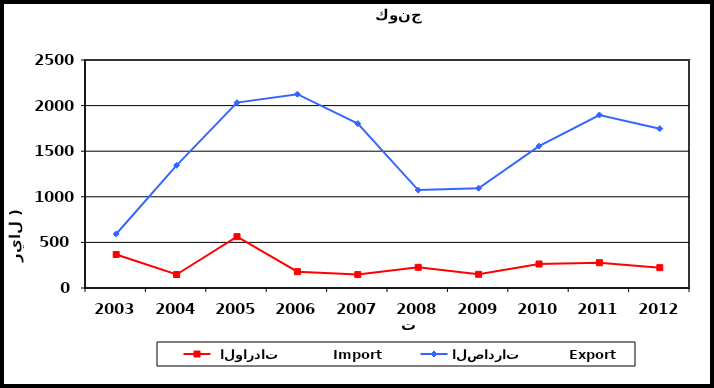
| Category |  الواردات           Import | الصادرات          Export |
|---|---|---|
| 2003.0 | 367 | 592 |
| 2004.0 | 148 | 1345 |
| 2005.0 | 563 | 2033 |
| 2006.0 | 179 | 2125 |
| 2007.0 | 147 | 1802 |
| 2008.0 | 227 | 1074 |
| 2009.0 | 150 | 1094 |
| 2010.0 | 263 | 1556 |
| 2011.0 | 277 | 1897 |
| 2012.0 | 223 | 1747 |